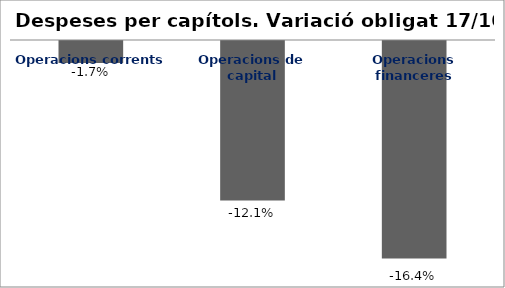
| Category | Series 0 |
|---|---|
| Operacions corrents | -0.017 |
| Operacions de capital | -0.121 |
| Operacions financeres | -0.164 |